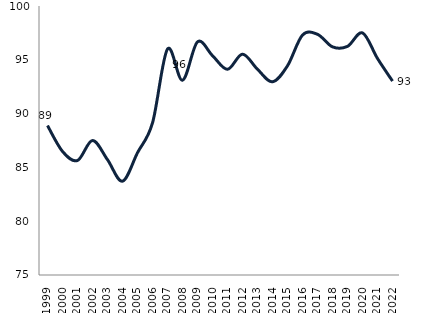
| Category | Series 1 |
|---|---|
| 1999.0 | 88.889 |
| 2000.0 | 86.486 |
| 2001.0 | 85.641 |
| 2002.0 | 87.5 |
| 2003.0 | 85.714 |
| 2004.0 | 83.721 |
| 2005.0 | 86.364 |
| 2006.0 | 89.13 |
| 2007.0 | 96 |
| 2008.0 | 93.103 |
| 2009.0 | 96.667 |
| 2010.0 | 95.385 |
| 2011.0 | 94.118 |
| 2012.0 | 95.522 |
| 2013.0 | 94.118 |
| 2014.0 | 92.958 |
| 2015.0 | 94.444 |
| 2016.0 | 97.297 |
| 2017.0 | 97.368 |
| 2018.0 | 96.203 |
| 2019.0 | 96.25 |
| 2020.0 | 97.5 |
| 2021.0 | 95.122 |
| 2022.0 | 93.023 |